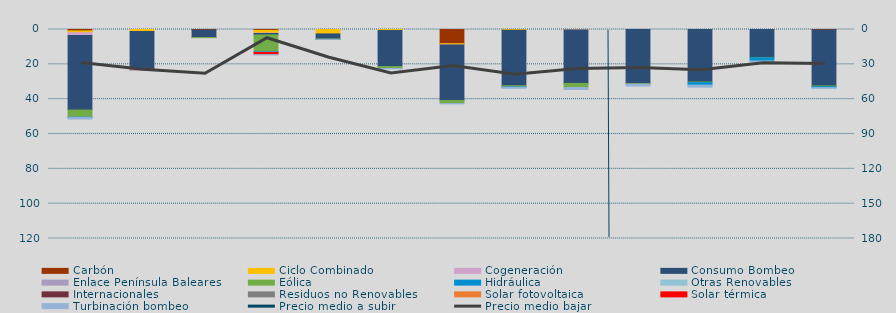
| Category | Carbón | Ciclo Combinado | Cogeneración | Consumo Bombeo | Enlace Península Baleares | Eólica | Hidráulica | Otras Renovables | Internacionales | Residuos no Renovables | Solar fotovoltaica | Solar térmica | Turbinación bombeo |
|---|---|---|---|---|---|---|---|---|---|---|---|---|---|
| 0 | 808.2 | 1016.6 | 1618.6 | 42815.3 | 0 | 4070.8 | 105.9 | 51.2 |  | 12.8 | 0 | 0 | 879 |
| 1 | 0 | 1097.9 | 0 | 21404.4 | 0 | 137.4 | 0 | 0 |  | 0 | 0 | 518.8 | 108.8 |
| 2 | 294.2 | 0 | 0 | 4310.8 | 42.4 | 0.6 | 0 | 0 |  | 0 | 0 | 0 | 0 |
| 3 | 516.7 | 1537.9 | 257 | 809.6 | 0 | 9502.9 | 408.7 | 117.5 |  | 0 | 0.4 | 1254.7 | 102.9 |
| 4 | 0 | 2533.1 | 0 | 2991.4 | 0 | 42.6 | 0 | 0 |  | 0 | 0 | 0 | 65 |
| 5 | 0 | 555.8 | 0 | 20748.5 | 0 | 1071 | 8.2 | 0 |  | 0 | 0 | 0 | 183.2 |
| 6 | 8149.5 | 754.8 | 3.5 | 31856.3 | 0 | 1760.6 | 0 | 0 |  | 0 | 0 | 0 | 177.8 |
| 7 | 0 | 458.3 | 0 | 31829.7 | 0 | 671.7 | 189.5 | 0 |  | 0 | 0 | 0 | 613.5 |
| 8 | 0 | 223.8 | 2.4 | 30752.2 | 0 | 2324.3 | 0 | 0 |  | 0 | 0 | 0 | 1135.9 |
| 9 | 0 | 0 | 0 | 31097.5 | 0 | 268.5 | 0 | 0 |  | 0 | 0 | 0 | 1121.8 |
| 10 | 0 | 20 | 0 | 30123.6 | 0 | 373.8 | 1416.6 | 0 |  | 0 | 0 | 0 | 1190.9 |
| 11 | 0 | 0 | 0 | 16053.6 | 0 | 185.3 | 1837.6 | 0 |  | 0 | 0 | 0 | 606.6 |
| 12 | 350.4 | 0 | 0 | 32084.5 | 0 | 425.7 | 531.2 | 0 |  | 0 | 0 | 0 | 413.1 |